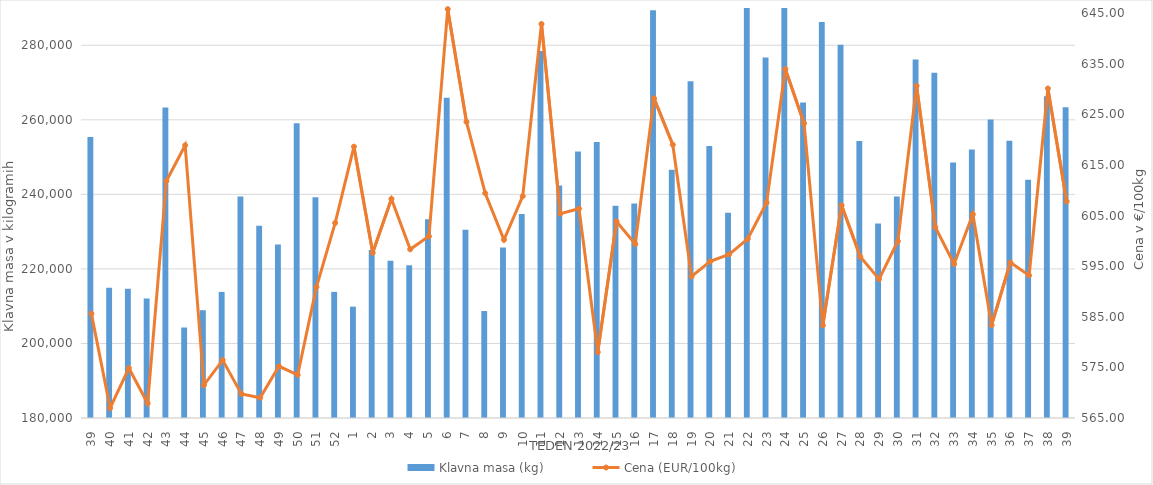
| Category | Klavna masa (kg) |
|---|---|
| 39.0 | 255370 |
| 40.0 | 214936 |
| 41.0 | 214672 |
| 42.0 | 212066 |
| 43.0 | 263287 |
| 44.0 | 204280 |
| 45.0 | 208920 |
| 46.0 | 213836 |
| 47.0 | 239417 |
| 48.0 | 231565 |
| 49.0 | 226575 |
| 50.0 | 259073 |
| 51.0 | 239211 |
| 52.0 | 213841 |
| 1.0 | 209877 |
| 2.0 | 225045 |
| 3.0 | 222198 |
| 4.0 | 221002 |
| 5.0 | 233306 |
| 6.0 | 265944 |
| 7.0 | 230531 |
| 8.0 | 208699 |
| 9.0 | 225712 |
| 10.0 | 234762 |
| 11.0 | 278467 |
| 12.0 | 242369 |
| 13.0 | 251507 |
| 14.0 | 254072 |
| 15.0 | 236964 |
| 16.0 | 237552 |
| 17.0 | 289400 |
| 18.0 | 246616 |
| 19.0 | 270374 |
| 20.0 | 252984 |
| 21.0 | 235060 |
| 22.0 | 290816 |
| 23.0 | 276702 |
| 24.0 | 292976 |
| 25.0 | 264669 |
| 26.0 | 286237 |
| 27.0 | 280112 |
| 28.0 | 254336 |
| 29.0 | 232178 |
| 30.0 | 239437 |
| 31.0 | 276163 |
| 32.0 | 272647 |
| 33.0 | 248536 |
| 34.0 | 252050 |
| 35.0 | 260110 |
| 36.0 | 254389 |
| 37.0 | 243933 |
| 38.0 | 266321 |
| 39.0 | 263346 |